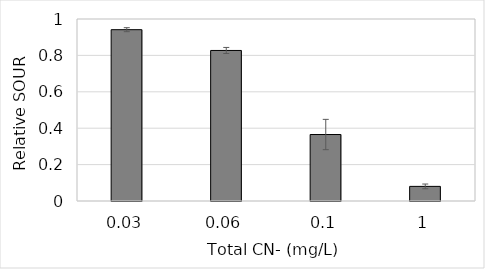
| Category | Rel sOUR |
|---|---|
| 0.03 | 0.941 |
| 0.06 | 0.827 |
| 0.1 | 0.365 |
| 1.0 | 0.08 |